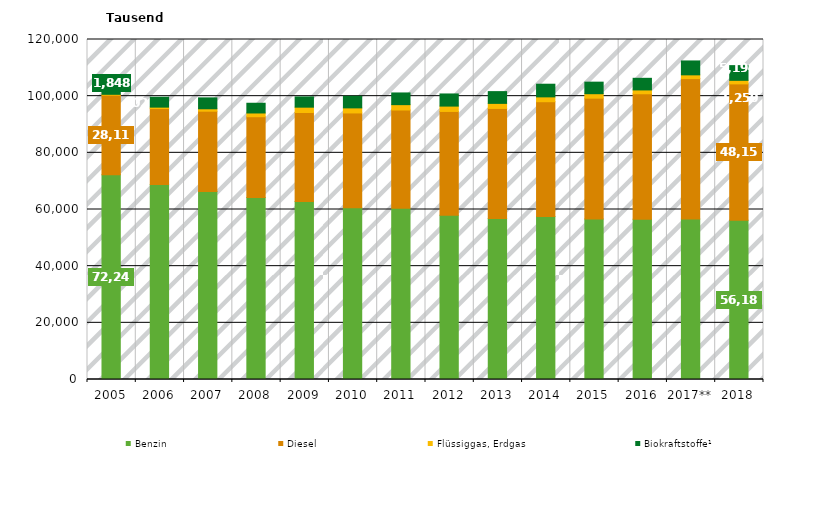
| Category | Benzin | Diesel | Flüssiggas, Erdgas | Biokraftstoffe¹ |
|---|---|---|---|---|
| 2005 | 72241.288 | 28110.89 | 301.818 | 1847.907 |
| 2006 | 68823.404 | 26800.299 | 505.468 | 3493.854 |
| 2007 | 66375.43 | 28320.774 | 854.312 | 3844.064 |
| 2008 | 64241.57 | 28506.82 | 1318.065 | 3431.565 |
| 2009 | 62792.204 | 31435.206 | 1889.209 | 3620.16 |
| 2010 | 60603.524 | 33478.795 | 1782.668 | 4096.028 |
| 2011 | 60471.733 | 34643.37 | 1893.38 | 4127.535 |
| 2012 | 58004.16 | 36603.422 | 1887.459 | 4284.961 |
| 2013 | 56849.366 | 38819.907 | 1782.664 | 4154.269 |
| 2014 | 57490.497 | 40551.372 | 1711.527 | 4464.726 |
| 2015 | 56671.552 | 42627.485 | 1570.564 | 4076.751 |
| 2016 | 56600.034 | 44249.27 | 1350.813 | 4101.055 |
| 2017** | 56604.851 | 49589.122 | 1330.813 | 4906.653 |
| 2018 | 56186.047 | 48149.632 | 1250.325 | 5193.911 |